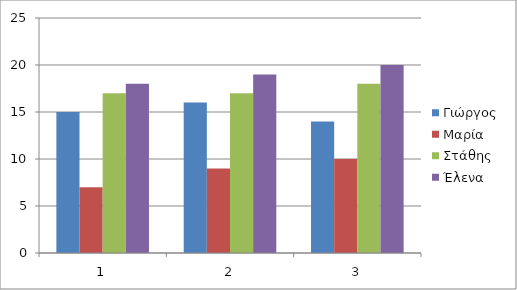
| Category | Γιώργος | Μαρία | Στάθης | Έλενα  |
|---|---|---|---|---|
| 0 | 15 | 7 | 17 | 18 |
| 1 | 16 | 9 | 17 | 19 |
| 2 | 14 | 10 | 18 | 20 |